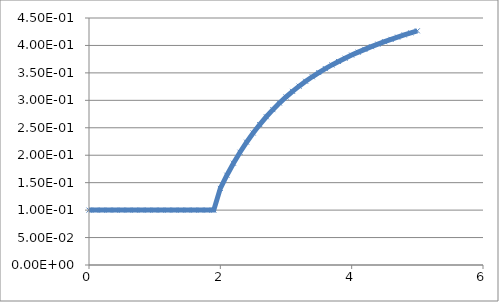
| Category | Series 0 |
|---|---|
| 0.0 | 0.1 |
| 0.1 | 0.1 |
| 0.2 | 0.1 |
| 0.3 | 0.1 |
| 0.4 | 0.1 |
| 0.5 | 0.1 |
| 0.6 | 0.1 |
| 0.7 | 0.1 |
| 0.8 | 0.1 |
| 0.9 | 0.1 |
| 1.0 | 0.1 |
| 1.1 | 0.1 |
| 1.2 | 0.1 |
| 1.3 | 0.1 |
| 1.4 | 0.1 |
| 1.5 | 0.1 |
| 1.6 | 0.1 |
| 1.7 | 0.1 |
| 1.8 | 0.1 |
| 1.9 | 0.1 |
| 2.0 | 0.14 |
| 2.1 | 0.164 |
| 2.2 | 0.185 |
| 2.3 | 0.205 |
| 2.4 | 0.224 |
| 2.5 | 0.241 |
| 2.6 | 0.256 |
| 2.7 | 0.27 |
| 2.8 | 0.283 |
| 2.9 | 0.295 |
| 3.0 | 0.306 |
| 3.1 | 0.316 |
| 3.2 | 0.326 |
| 3.3 | 0.335 |
| 3.4 | 0.343 |
| 3.5 | 0.351 |
| 3.6 | 0.358 |
| 3.7 | 0.364 |
| 3.8 | 0.371 |
| 3.9 | 0.377 |
| 4.0 | 0.382 |
| 4.1 | 0.388 |
| 4.2 | 0.393 |
| 4.3 | 0.398 |
| 4.4 | 0.402 |
| 4.5 | 0.407 |
| 4.6 | 0.411 |
| 4.7 | 0.415 |
| 4.8 | 0.419 |
| 4.9 | 0.423 |
| 5.0 | 0.427 |